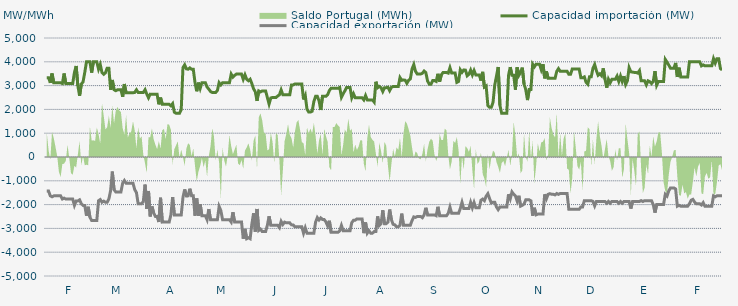
| Category | Capacidad importación (MW) | Capacidad exportación (MW) |
|---|---|---|
| 0 | 3333.333 | -1433.333 |
| 1900-01-01 | 3333.333 | -1433.333 |
| 1900-01-02 | 3116.667 | -1633.333 |
| 1900-01-03 | 3508.333 | -1670.833 |
| 1900-01-04 | 3116.667 | -1633.333 |
| 1900-01-05 | 3116.667 | -1633.333 |
| 1900-01-06 | 3116.667 | -1633.333 |
| 1900-01-07 | 3116.667 | -1633.333 |
| 1900-01-08 | 3116.667 | -1633.333 |
| 1900-01-09 | 3087.5 | -1766.667 |
| 1900-01-10 | 3508.333 | -1729.167 |
| 1900-01-11 | 3087.5 | -1766.667 |
| 1900-01-12 | 3087.5 | -1766.667 |
| 1900-01-13 | 3087.5 | -1766.667 |
| 1900-01-14 | 3087.5 | -1766.667 |
| 1900-01-15 | 3087.5 | -1766.667 |
| 1900-01-16 | 3550 | -2033.333 |
| 1900-01-17 | 3825 | -1845.833 |
| 1900-01-18 | 2987.5 | -1845.833 |
| 1900-01-19 | 2575 | -1800 |
| 1900-01-20 | 3062.5 | -1962.5 |
| 1900-01-21 | 3154.167 | -2033.333 |
| 1900-01-22 | 3550 | -2033.333 |
| 1900-01-23 | 4000 | -2466.667 |
| 1900-01-24 | 4000 | -2091.667 |
| 1900-01-25 | 4000 | -2529.167 |
| 1900-01-26 | 3545.833 | -2666.667 |
| 1900-01-27 | 4000 | -2666.667 |
| 1900-01-28 | 4000 | -2666.667 |
| 1900-01-29 | 4000 | -2666.667 |
| 1900-01-30 | 3691.667 | -1837.5 |
| 1900-01-31 | 3883.333 | -1787.5 |
| 1900-02-01 | 3545.833 | -1900 |
| 1900-02-02 | 3475 | -1854.167 |
| 1900-02-03 | 3537.5 | -1900 |
| 1900-02-04 | 3733.333 | -1900 |
| 1900-02-05 | 3733.333 | -1762.5 |
| 1900-02-06 | 2825 | -1416.667 |
| 1900-02-07 | 3237.5 | -612.5 |
| 1900-02-08 | 2825 | -1370.833 |
| 1900-02-09 | 2787.5 | -1466.667 |
| 1900-02-10 | 2825 | -1466.667 |
| 1900-02-11 | 2825 | -1466.667 |
| 1900-02-12 | 2825 | -1466.667 |
| 1900-02-13 | 2529.167 | -1100 |
| 1900-02-14 | 3066.667 | -987.5 |
| 1900-02-15 | 2700 | -1100 |
| 1900-02-16 | 2700 | -1100 |
| 1900-02-17 | 2700 | -1100 |
| 1900-02-18 | 2700 | -1100 |
| 1900-02-19 | 2700 | -1100 |
| 1900-02-20 | 2712.5 | -1368.75 |
| 1900-02-21 | 2823.913 | -1495.652 |
| 1900-02-22 | 2712.5 | -1966.667 |
| 1900-02-23 | 2712.5 | -1966.667 |
| 1900-02-24 | 2712.5 | -1966.667 |
| 1900-02-25 | 2712.5 | -1862.5 |
| 1900-02-26 | 2827.083 | -1160.417 |
| 1900-02-27 | 2645.833 | -2179.167 |
| 1900-02-28 | 2487.5 | -1427.083 |
| 1900-02-28 | 2639.583 | -2495.833 |
| 1900-03-01 | 2633.333 | -2079.167 |
| 1900-03-02 | 2633.333 | -2350 |
| 1900-03-03 | 2633.333 | -2500 |
| 1900-03-04 | 2633.333 | -2500 |
| 1900-03-05 | 2212.5 | -2733.333 |
| 1900-03-06 | 2495.833 | -1712.5 |
| 1900-03-07 | 2212.5 | -2733.333 |
| 1900-03-08 | 2212.5 | -2725 |
| 1900-03-09 | 2212.5 | -2733.333 |
| 1900-03-10 | 2212.5 | -2733.333 |
| 1900-03-11 | 2212.5 | -2733.333 |
| 1900-03-12 | 2150 | -2433.333 |
| 1900-03-13 | 2241.667 | -1683.333 |
| 1900-03-14 | 1883.333 | -2433.333 |
| 1900-03-15 | 1837.5 | -2433.333 |
| 1900-03-16 | 1837.5 | -2433.333 |
| 1900-03-17 | 1837.5 | -2433.333 |
| 1900-03-18 | 1987.5 | -2433.333 |
| 1900-03-19 | 3754.167 | -1700 |
| 1900-03-20 | 3870.833 | -1362.5 |
| 1900-03-21 | 3704.167 | -1637.5 |
| 1900-03-22 | 3687.5 | -1633.333 |
| 1900-03-23 | 3743.75 | -1333.333 |
| 1900-03-24 | 3687.5 | -1633.333 |
| 1900-03-25 | 3687.5 | -1633.333 |
| 1900-03-26 | 3125 | -2466.667 |
| 1900-03-27 | 2762.5 | -1741.667 |
| 1900-03-28 | 3125 | -2466.667 |
| 1900-03-29 | 2881.25 | -1979.167 |
| 1900-03-30 | 3125 | -2466.667 |
| 1900-03-31 | 3125 | -2466.667 |
| 1900-04-01 | 3125 | -2466.667 |
| 1900-04-02 | 2941.667 | -2633.333 |
| 1900-04-03 | 2852.083 | -2187.5 |
| 1900-04-04 | 2752.083 | -2633.333 |
| 1900-04-05 | 2712.5 | -2633.333 |
| 1900-04-06 | 2712.5 | -2633.333 |
| 1900-04-07 | 2712.5 | -2633.333 |
| 1900-04-08 | 2795.833 | -2633.333 |
| 1900-04-09 | 3125 | -2079.583 |
| 1900-04-10 | 3029.167 | -2250 |
| 1900-04-11 | 3125 | -2633.333 |
| 1900-04-12 | 3125 | -2633.333 |
| 1900-04-13 | 3125 | -2633.333 |
| 1900-04-14 | 3125 | -2633.333 |
| 1900-04-15 | 3125 | -2633.333 |
| 1900-04-16 | 3483.333 | -2733.333 |
| 1900-04-17 | 3358.333 | -2320.833 |
| 1900-04-18 | 3429.167 | -2733.333 |
| 1900-04-19 | 3483.333 | -2733.333 |
| 1900-04-20 | 3483.333 | -2733.333 |
| 1900-04-21 | 3483.333 | -2733.333 |
| 1900-04-22 | 3483.333 | -2733.333 |
| 1900-04-23 | 3266.667 | -3433.333 |
| 1900-04-24 | 3454.167 | -3020.833 |
| 1900-04-25 | 3266.667 | -3433.333 |
| 1900-04-26 | 3204.167 | -3391.667 |
| 1900-04-27 | 3266.667 | -3433.333 |
| 1900-04-28 | 3083.333 | -2816.667 |
| 1900-04-29 | 2866.667 | -2362.5 |
| 1900-04-30 | 2737.5 | -3133.333 |
| 1900-05-01 | 2358.333 | -2183.333 |
| 1900-05-02 | 2775 | -3085.417 |
| 1900-05-03 | 2733.333 | -3029.167 |
| 1900-05-04 | 2775 | -3133.333 |
| 1900-05-05 | 2775 | -3133.333 |
| 1900-05-06 | 2775 | -3133.333 |
| 1900-05-07 | 2500 | -2866.667 |
| 1900-05-08 | 2225 | -2491.667 |
| 1900-05-09 | 2481.25 | -2866.667 |
| 1900-05-10 | 2500 | -2866.667 |
| 1900-05-11 | 2500 | -2866.667 |
| 1900-05-12 | 2500 | -2866.667 |
| 1900-05-13 | 2562.5 | -2866.667 |
| 1900-05-14 | 2612.5 | -2966.667 |
| 1900-05-15 | 2818.75 | -2704.167 |
| 1900-05-16 | 2612.5 | -2833.333 |
| 1900-05-17 | 2612.5 | -2737.5 |
| 1900-05-18 | 2612.5 | -2766.667 |
| 1900-05-19 | 2612.5 | -2766.667 |
| 1900-05-20 | 2612.5 | -2766.667 |
| 1900-05-21 | 3025 | -2850 |
| 1900-05-22 | 3029.167 | -2858.333 |
| 1900-05-23 | 3066.667 | -2933.333 |
| 1900-05-24 | 3066.667 | -2933.333 |
| 1900-05-25 | 3066.667 | -2933.333 |
| 1900-05-26 | 3066.667 | -2933.333 |
| 1900-05-27 | 3066.667 | -2933.333 |
| 1900-05-28 | 2416.667 | -3200 |
| 1900-05-29 | 2585.417 | -2975 |
| 1900-05-30 | 2012.5 | -3200 |
| 1900-05-31 | 1887.5 | -3200 |
| 1900-06-01 | 1887.5 | -3200 |
| 1900-06-02 | 1920.833 | -3200 |
| 1900-06-03 | 2333.333 | -3200 |
| 1900-06-04 | 2550 | -2733.333 |
| 1900-06-05 | 2550 | -2545.833 |
| 1900-06-06 | 2362.5 | -2645.833 |
| 1900-06-07 | 1975 | -2558.333 |
| 1900-06-08 | 2550 | -2629.167 |
| 1900-06-09 | 2550 | -2629.167 |
| 1900-06-10 | 2550 | -2729.167 |
| 1900-06-11 | 2616.667 | -2895.833 |
| 1900-06-12 | 2793.75 | -2679.167 |
| 1900-06-13 | 2887.5 | -3166.667 |
| 1900-06-14 | 2887.5 | -3166.667 |
| 1900-06-15 | 2887.5 | -3166.667 |
| 1900-06-16 | 2887.5 | -3166.667 |
| 1900-06-17 | 2887.5 | -3166.667 |
| 1900-06-18 | 2925 | -3100 |
| 1900-06-19 | 2512.5 | -2875 |
| 1900-06-20 | 2658.333 | -3100 |
| 1900-06-21 | 2779.167 | -3100 |
| 1900-06-22 | 2925 | -3100 |
| 1900-06-23 | 2925 | -3100 |
| 1900-06-24 | 2925 | -3100 |
| 1900-06-25 | 2487.5 | -2758.333 |
| 1900-06-26 | 2656.25 | -2658.333 |
| 1900-06-27 | 2487.5 | -2654.167 |
| 1900-06-28 | 2487.5 | -2600 |
| 1900-06-29 | 2487.5 | -2600 |
| 1900-06-30 | 2487.5 | -2600 |
| 1900-07-01 | 2487.5 | -2600 |
| 1900-07-02 | 2400 | -3200 |
| 1900-07-03 | 2583.333 | -2750 |
| 1900-07-04 | 2400 | -3200 |
| 1900-07-05 | 2400 | -3100 |
| 1900-07-06 | 2400 | -3200 |
| 1900-07-07 | 2400 | -3200 |
| 1900-07-08 | 2308.333 | -3133.333 |
| 1900-07-09 | 3162.5 | -3133.333 |
| 1900-07-10 | 2910.417 | -2495.833 |
| 1900-07-11 | 2962.5 | -2875 |
| 1900-07-12 | 2912.5 | -2800 |
| 1900-07-13 | 2752.083 | -2237.5 |
| 1900-07-14 | 2912.5 | -2800 |
| 1900-07-15 | 2912.5 | -2800 |
| 1900-07-16 | 2933.333 | -2733.333 |
| 1900-07-17 | 2787.5 | -2208.333 |
| 1900-07-18 | 2929.167 | -2633.333 |
| 1900-07-19 | 2962.5 | -2829.167 |
| 1900-07-20 | 2962.5 | -2850 |
| 1900-07-21 | 2962.5 | -2933.333 |
| 1900-07-22 | 2962.5 | -2933.333 |
| 1900-07-23 | 3337.5 | -2866.667 |
| 1900-07-24 | 3222.917 | -2379.167 |
| 1900-07-25 | 3237.5 | -2866.667 |
| 1900-07-26 | 3225 | -2866.667 |
| 1900-07-27 | 3095.833 | -2866.667 |
| 1900-07-28 | 3225 | -2866.667 |
| 1900-07-29 | 3281.25 | -2866.667 |
| 1900-07-30 | 3700 | -2666.667 |
| 1900-07-31 | 3883.333 | -2516.667 |
| 1900-08-01 | 3600 | -2537.5 |
| 1900-08-02 | 3487.5 | -2500 |
| 1900-08-03 | 3487.5 | -2500 |
| 1900-08-04 | 3487.5 | -2500 |
| 1900-08-05 | 3518.75 | -2550 |
| 1900-08-06 | 3612.5 | -2433.333 |
| 1900-08-07 | 3543.75 | -2133.333 |
| 1900-08-08 | 3193.75 | -2433.333 |
| 1900-08-09 | 3060.417 | -2433.333 |
| 1900-08-10 | 3059.167 | -2433.333 |
| 1900-08-11 | 3212.5 | -2433.333 |
| 1900-08-12 | 3212.5 | -2433.333 |
| 1900-08-13 | 3175 | -2466.667 |
| 1900-08-14 | 3495.833 | -2091.667 |
| 1900-08-15 | 3166.667 | -2466.667 |
| 1900-08-16 | 3454.167 | -2466.667 |
| 1900-08-17 | 3550 | -2466.667 |
| 1900-08-18 | 3550 | -2466.667 |
| 1900-08-19 | 3550 | -2466.667 |
| 1900-08-20 | 3525 | -2366.667 |
| 1900-08-21 | 3754.167 | -2104.167 |
| 1900-08-22 | 3525 | -2366.667 |
| 1900-08-23 | 3525 | -2366.667 |
| 1900-08-24 | 3525 | -2366.667 |
| 1900-08-25 | 3135 | -2366.667 |
| 1900-08-26 | 3175 | -2366.667 |
| 1900-08-27 | 3666.667 | -2166.667 |
| 1900-08-28 | 3558.333 | -1904.167 |
| 1900-08-29 | 3658.333 | -2166.667 |
| 1900-08-30 | 3650 | -2166.667 |
| 1900-08-31 | 3412.5 | -2166.667 |
| 1900-09-01 | 3475 | -2166.667 |
| 1900-09-02 | 3650 | -1904.167 |
| 1900-09-03 | 3450 | -2133.333 |
| 1900-09-04 | 3633.333 | -1912.5 |
| 1900-09-05 | 3450 | -2133.333 |
| 1900-09-06 | 3450 | -2133.333 |
| 1900-09-07 | 3450 | -2133.333 |
| 1900-09-08 | 3210.417 | -1816.667 |
| 1900-09-09 | 3577.083 | -1766.667 |
| 1900-09-10 | 2937.5 | -1833.333 |
| 1900-09-11 | 2985.417 | -1645.833 |
| 1900-09-12 | 2162.5 | -1541.667 |
| 1900-09-13 | 2087.5 | -1745.833 |
| 1900-09-14 | 2087.5 | -1929.167 |
| 1900-09-15 | 2295.833 | -1900 |
| 1900-09-16 | 3025 | -1900 |
| 1900-09-17 | 3395.833 | -2100 |
| 1900-09-18 | 3781.25 | -2212.5 |
| 1900-09-19 | 2170.833 | -2100 |
| 1900-09-20 | 1837.5 | -2100 |
| 1900-09-21 | 1837.5 | -2100 |
| 1900-09-22 | 1837.5 | -2100 |
| 1900-09-23 | 1837.5 | -2100 |
| 1900-09-24 | 3433.333 | -1566.667 |
| 1900-09-25 | 3776 | -1760 |
| 1900-09-26 | 3433.333 | -1466.667 |
| 1900-09-27 | 3433.333 | -1566.667 |
| 1900-09-28 | 2829.167 | -1633.333 |
| 1900-09-29 | 3766.667 | -1854.167 |
| 1900-09-30 | 3433.333 | -1629.167 |
| 1900-10-01 | 3562.5 | -2066.667 |
| 1900-10-02 | 3754.167 | -2029.167 |
| 1900-10-03 | 3064.583 | -1979.167 |
| 1900-10-04 | 2833.333 | -1800 |
| 1900-10-05 | 2391.667 | -1800 |
| 1900-10-06 | 2833.333 | -1800 |
| 1900-10-07 | 2833.333 | -1841.667 |
| 1900-10-08 | 3900 | -2466.667 |
| 1900-10-09 | 3787.5 | -2133.333 |
| 1900-10-10 | 3900 | -2429.167 |
| 1900-10-11 | 3900 | -2400 |
| 1900-10-12 | 3900 | -2400 |
| 1900-10-13 | 3668.75 | -2400 |
| 1900-10-14 | 3900 | -2400 |
| 1900-10-15 | 3304.167 | -1566.667 |
| 1900-10-16 | 3595.833 | -1754.167 |
| 1900-10-17 | 3304.167 | -1566.667 |
| 1900-10-18 | 3304.167 | -1541.667 |
| 1900-10-19 | 3304.167 | -1566.667 |
| 1900-10-20 | 3304.167 | -1566.667 |
| 1900-10-21 | 3304.167 | -1591.667 |
| 1900-10-22 | 3600 | -1533.333 |
| 1900-10-23 | 3712.5 | -1570.833 |
| 1900-10-24 | 3600 | -1533.333 |
| 1900-10-25 | 3600 | -1533.333 |
| 1900-10-26 | 3600 | -1533.333 |
| 1900-10-27 | 3600 | -1533.333 |
| 1900-10-28 | 3600 | -1533.333 |
| 1900-10-29 | 3475 | -2200 |
| 1900-10-30 | 3475 | -2200 |
| 1900-10-31 | 3700 | -2200 |
| 1900-11-01 | 3700 | -2200 |
| 1900-11-02 | 3700 | -2200 |
| 1900-11-03 | 3700 | -2200 |
| 1900-11-04 | 3700 | -2200 |
| 1900-11-05 | 3329.167 | -2095.833 |
| 1900-11-06 | 3329.167 | -2095.833 |
| 1900-11-07 | 3366.667 | -1833.333 |
| 1900-11-08 | 3141.667 | -1833.333 |
| 1900-11-09 | 3058.333 | -1833.333 |
| 1900-11-10 | 3366.667 | -1833.333 |
| 1900-11-11 | 3366.667 | -1833.333 |
| 1900-11-12 | 3725 | -1866.667 |
| 1900-11-13 | 3883.333 | -2054.167 |
| 1900-11-14 | 3631.25 | -1866.667 |
| 1900-11-15 | 3435.417 | -1866.667 |
| 1900-11-16 | 3495.833 | -1866.667 |
| 1900-11-17 | 3416.667 | -1866.667 |
| 1900-11-18 | 3725 | -1866.667 |
| 1900-11-19 | 3266.667 | -1866.667 |
| 1900-11-20 | 2912.5 | -1941.667 |
| 1900-11-21 | 3266.667 | -1866.667 |
| 1900-11-22 | 3116.667 | -1941.667 |
| 1900-11-23 | 3266.667 | -1866.667 |
| 1900-11-24 | 3266.667 | -1866.667 |
| 1900-11-25 | 3266.667 | -1866.667 |
| 1900-11-26 | 3400 | -1866.667 |
| 1900-11-27 | 3175 | -1941.667 |
| 1900-11-28 | 3400 | -1866.667 |
| 1900-11-29 | 3175 | -1941.667 |
| 1900-11-30 | 3400 | -1866.667 |
| 1900-12-01 | 3047.917 | -1866.667 |
| 1900-12-02 | 3200 | -1866.667 |
| 1900-12-03 | 3754.167 | -1866.667 |
| 1900-12-04 | 3581.25 | -2166.667 |
| 1900-12-05 | 3566.667 | -1866.667 |
| 1900-12-06 | 3554.167 | -1866.667 |
| 1900-12-07 | 3554.167 | -1866.667 |
| 1900-12-08 | 3525 | -1866.667 |
| 1900-12-09 | 3629.167 | -1866.667 |
| 1900-12-10 | 3200 | -1833.333 |
| 1900-12-11 | 3200 | -1870.833 |
| 1900-12-12 | 3200 | -1833.333 |
| 1900-12-13 | 3031.25 | -1833.333 |
| 1900-12-14 | 3200 | -1833.333 |
| 1900-12-15 | 3162.5 | -1833.333 |
| 1900-12-16 | 3083.333 | -1833.333 |
| 1900-12-17 | 3175 | -2000 |
| 1900-12-18 | 3608.333 | -2337.5 |
| 1900-12-19 | 3016.667 | -2000 |
| 1900-12-20 | 3175 | -2000 |
| 1900-12-21 | 3175 | -2000 |
| 1900-12-22 | 3175 | -2000 |
| 1900-12-23 | 3175 | -2000 |
| 1900-12-24 | 4100 | -1566.667 |
| 1900-12-25 | 3987.5 | -1641.667 |
| 1900-12-26 | 3864.583 | -1425 |
| 1900-12-27 | 3733.333 | -1300 |
| 1900-12-28 | 3733.333 | -1300 |
| 1900-12-29 | 3733.333 | -1300 |
| 1900-12-30 | 3952.083 | -1341.667 |
| 1900-12-31 | 3362.5 | -2066.667 |
| 1901-01-01 | 3752.083 | -2029.167 |
| 1901-01-02 | 3362.5 | -2066.667 |
| 1901-01-03 | 3362.5 | -2066.667 |
| 1901-01-04 | 3362.5 | -2066.667 |
| 1901-01-05 | 3362.5 | -2066.667 |
| 1901-01-06 | 3362.5 | -2066.667 |
| 1901-01-07 | 4000 | -1966.667 |
| 1901-01-08 | 4000 | -1816.667 |
| 1901-01-09 | 4000 | -1779.167 |
| 1901-01-10 | 4000 | -1891.667 |
| 1901-01-11 | 4000 | -1966.667 |
| 1901-01-12 | 4000 | -1966.667 |
| 1901-01-13 | 4000 | -1966.667 |
| 1901-01-14 | 3829.167 | -2016.667 |
| 1901-01-15 | 3870.833 | -1916.667 |
| 1901-01-16 | 3829.167 | -2066.667 |
| 1901-01-17 | 3829.167 | -2066.667 |
| 1901-01-18 | 3829.167 | -2066.667 |
| 1901-01-19 | 3829.167 | -2066.667 |
| 1901-01-20 | 3829.167 | -2066.667 |
| 1901-01-21 | 4133.333 | -1633.333 |
| 1901-01-22 | 3945.833 | -1670.833 |
| 1901-01-23 | 4133.333 | -1633.333 |
| 1901-01-24 | 4133.333 | -1633.333 |
| 1901-01-25 | 3716.667 | -1633.333 |
| 1901-01-26 | 3658.333 | -1633.333 |